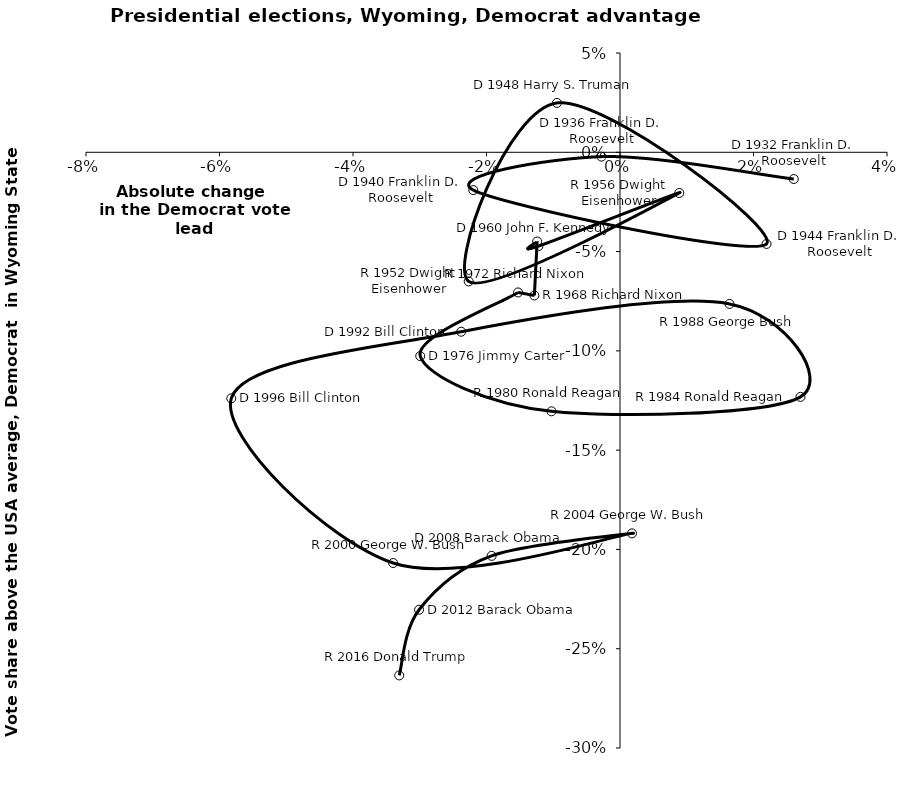
| Category | Series 0 |
|---|---|
| 0.02603371585600961 | -0.013 |
| -0.002785469390040929 | -0.002 |
| -0.021986841687751613 | -0.019 |
| 0.021951511872714186 | -0.046 |
| -0.009441009110685294 | 0.025 |
| -0.022669588411589003 | -0.065 |
| 0.008887705363998799 | -0.02 |
| -0.012225292547496852 | -0.047 |
| -0.01241781584023699 | -0.045 |
| -0.012827233656949738 | -0.072 |
| -0.015271733476287852 | -0.071 |
| -0.029927939185701052 | -0.103 |
| -0.010265000914478684 | -0.13 |
| 0.027039722092606466 | -0.123 |
| 0.01640643686354551 | -0.076 |
| -0.023788025821079833 | -0.09 |
| -0.058236616458846646 | -0.124 |
| -0.033986555673703844 | -0.207 |
| 0.0017962166697590154 | -0.192 |
| -0.01922954795273621 | -0.203 |
| -0.030101533251195106 | -0.23 |
| -0.033077987543784604 | -0.263 |